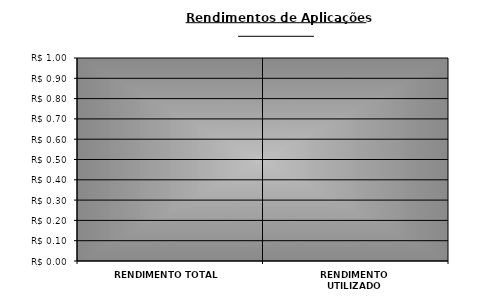
| Category | Series 0 |
|---|---|
| RENDIMENTO TOTAL | 0 |
| RENDIMENTO UTILIZADO | 0 |